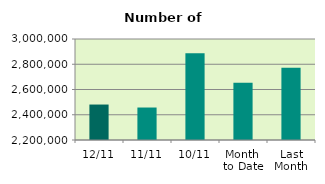
| Category | Series 0 |
|---|---|
| 12/11 | 2480890 |
| 11/11 | 2457284 |
| 10/11 | 2886982 |
| Month 
to Date | 2653578.6 |
| Last
Month | 2771381.143 |